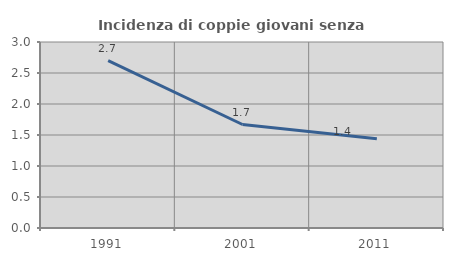
| Category | Incidenza di coppie giovani senza figli |
|---|---|
| 1991.0 | 2.699 |
| 2001.0 | 1.669 |
| 2011.0 | 1.44 |